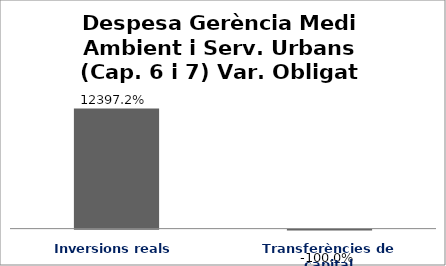
| Category | Series 0 |
|---|---|
| Inversions reals | 123.972 |
| Transferències de capital | -1 |